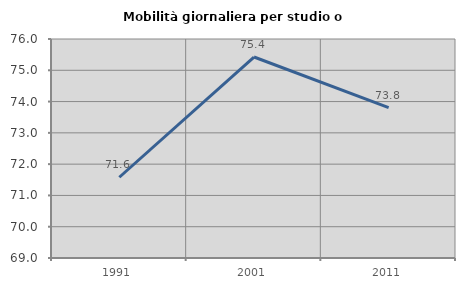
| Category | Mobilità giornaliera per studio o lavoro |
|---|---|
| 1991.0 | 71.581 |
| 2001.0 | 75.424 |
| 2011.0 | 73.81 |